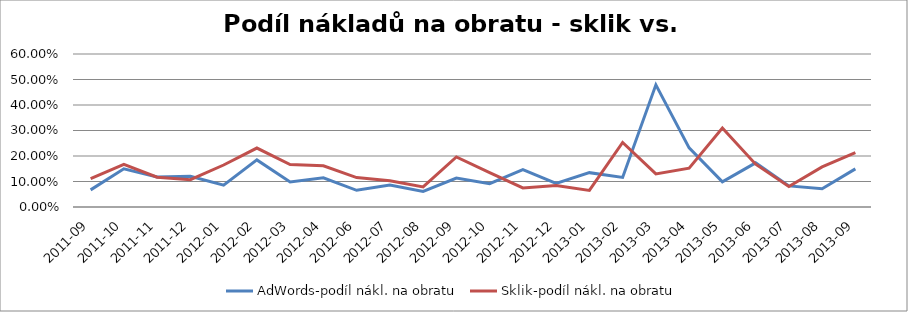
| Category | AdWords-podíl nákl. na obratu | Sklik-podíl nákl. na obratu |
|---|---|---|
| 2011-09 | 0.067 | 0.111 |
| 2011-10 | 0.15 | 0.167 |
| 2011-11 | 0.118 | 0.117 |
| 2011-12 | 0.12 | 0.107 |
| 2012-01 | 0.085 | 0.165 |
| 2012-02 | 0.185 | 0.231 |
| 2012-03 | 0.098 | 0.167 |
| 2012-04 | 0.114 | 0.162 |
| 2012-06 | 0.065 | 0.115 |
| 2012-07 | 0.086 | 0.103 |
| 2012-08 | 0.061 | 0.079 |
| 2012-09 | 0.113 | 0.196 |
| 2012-10 | 0.092 | 0.135 |
| 2012-11 | 0.146 | 0.075 |
| 2012-12 | 0.093 | 0.085 |
| 2013-01 | 0.135 | 0.065 |
| 2013-02 | 0.116 | 0.253 |
| 2013-03 | 0.479 | 0.13 |
| 2013-04 | 0.232 | 0.152 |
| 2013-05 | 0.099 | 0.31 |
| 2013-06 | 0.173 | 0.168 |
| 2013-07 | 0.083 | 0.081 |
| 2013-08 | 0.072 | 0.157 |
| 2013-09 | 0.15 | 0.214 |